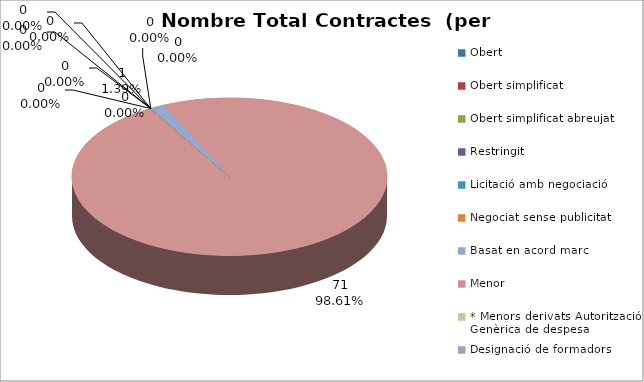
| Category | Nombre Total Contractes |
|---|---|
| Obert | 0 |
| Obert simplificat | 0 |
| Obert simplificat abreujat | 0 |
| Restringit | 0 |
| Licitació amb negociació | 0 |
| Negociat sense publicitat | 0 |
| Basat en acord marc | 1 |
| Menor | 71 |
| * Menors derivats Autorització Genèrica de despesa | 0 |
| Designació de formadors | 0 |